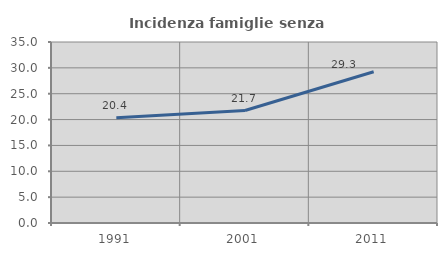
| Category | Incidenza famiglie senza nuclei |
|---|---|
| 1991.0 | 20.355 |
| 2001.0 | 21.748 |
| 2011.0 | 29.253 |